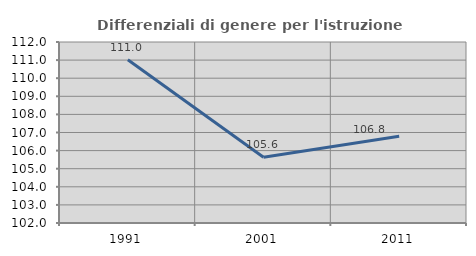
| Category | Differenziali di genere per l'istruzione superiore |
|---|---|
| 1991.0 | 111.021 |
| 2001.0 | 105.628 |
| 2011.0 | 106.799 |